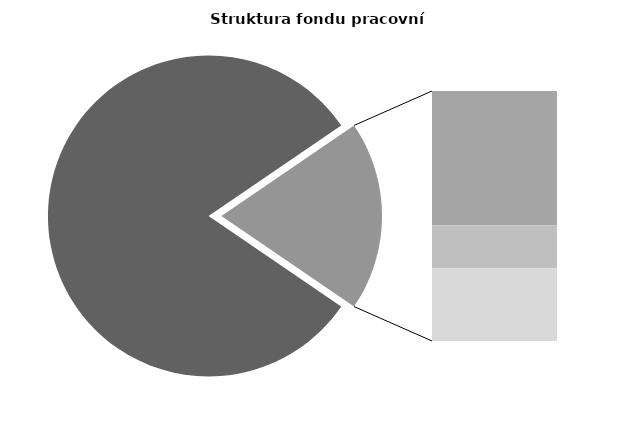
| Category | Series 0 |
|---|---|
| Průměrná měsíční odpracovaná doba bez přesčasu | 138.863 |
| Dovolená | 17.616 |
| Nemoc | 5.596 |
| Jiné | 9.513 |